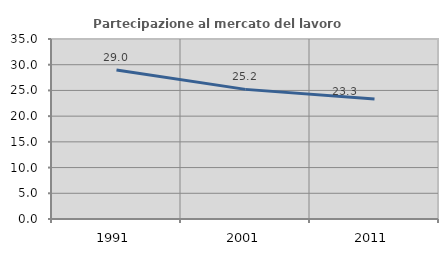
| Category | Partecipazione al mercato del lavoro  femminile |
|---|---|
| 1991.0 | 28.962 |
| 2001.0 | 25.204 |
| 2011.0 | 23.338 |